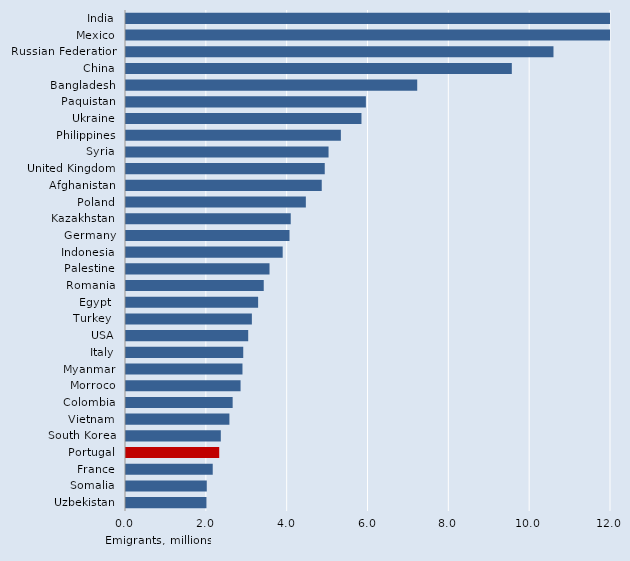
| Category | Series 0 |
|---|---|
| India | 15.576 |
| Mexico | 12.339 |
| Russian Federation | 10.577 |
| China | 9.546 |
| Bangladesh | 7.205 |
| Paquistan | 5.935 |
| Ukraine | 5.826 |
| Philippines | 5.316 |
| Syria | 5.012 |
| United Kingdom | 4.917 |
| Afghanistan | 4.843 |
| Poland | 4.45 |
| Kazakhstan | 4.076 |
| Germany | 4.045 |
| Indonesia | 3.877 |
| Palestine | 3.551 |
| Romania | 3.408 |
| Egypt  | 3.269 |
| Turkey  | 3.114 |
| USA | 3.024 |
| Italy | 2.901 |
| Myanmar | 2.882 |
| Morroco | 2.835 |
| Colombia | 2.639 |
| Vietnam | 2.559 |
| South Korea | 2.346 |
| Portugal | 2.306 |
| France | 2.146 |
| Somalia | 1.999 |
| Uzbekistan | 1.991 |